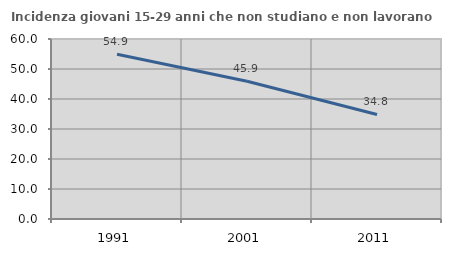
| Category | Incidenza giovani 15-29 anni che non studiano e non lavorano  |
|---|---|
| 1991.0 | 54.926 |
| 2001.0 | 45.938 |
| 2011.0 | 34.85 |